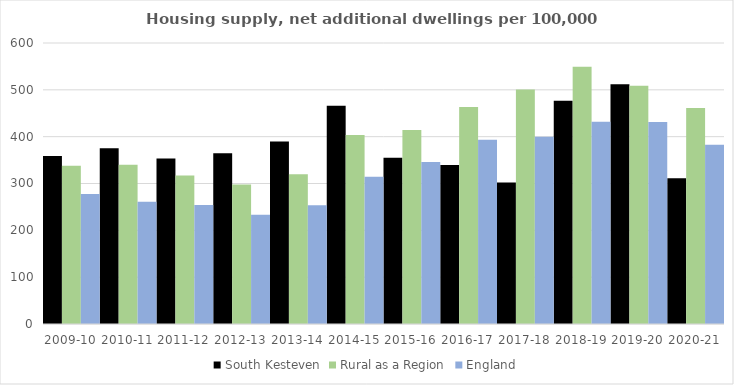
| Category | South Kesteven | Rural as a Region | England |
|---|---|---|---|
| 2009-10 | 358.505 | 337.852 | 277.548 |
| 2010-11 | 375.458 | 340.105 | 260.994 |
| 2011-12 | 353.402 | 317.04 | 254.007 |
| 2012-13 | 364.613 | 297.763 | 233.153 |
| 2013-14 | 389.424 | 319.835 | 253.602 |
| 2014-15 | 466.246 | 403.796 | 314.256 |
| 2015-16 | 355.154 | 414.091 | 346.154 |
| 2016-17 | 339.248 | 463.209 | 393.256 |
| 2017-18 | 302.128 | 500.68 | 399.646 |
| 2018-19 | 476.55 | 549.491 | 432.099 |
| 2019-20 | 511.852 | 508.493 | 431.187 |
| 2020-21 | 311.398 | 461.114 | 382.827 |